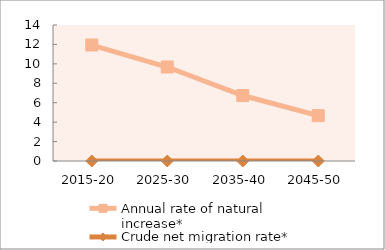
| Category | Annual rate of natural increase* | Crude net migration rate* |
|---|---|---|
| 2015-20 | 11.938 | 0 |
| 2025-30 | 9.675 | 0 |
| 2035-40 | 6.74 | 0 |
| 2045-50 | 4.669 | 0 |